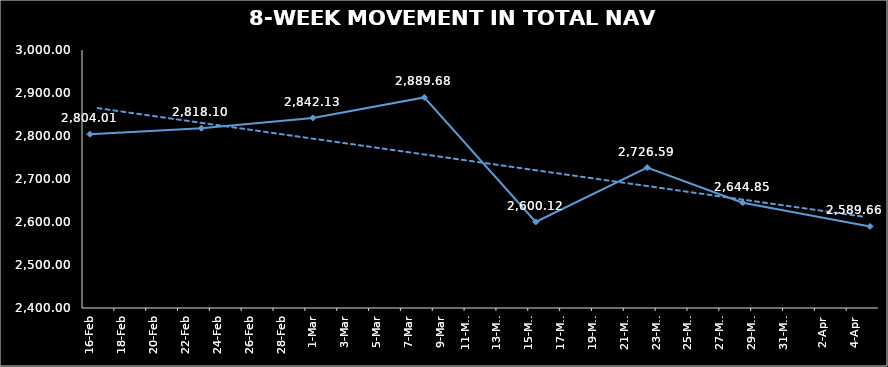
| Category | TOTAL NAV |
|---|---|
| 2024-02-16 | 2804.014 |
| 2024-02-23 | 2818.099 |
| 2024-03-01 | 2842.127 |
| 2024-03-08 | 2889.675 |
| 2024-03-15 | 2600.12 |
| 2024-03-22 | 2726.59 |
| 2024-03-28 | 2644.848 |
| 2024-04-05 | 2589.664 |